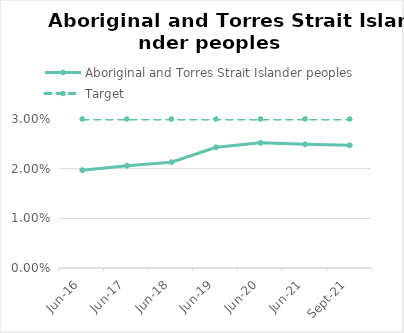
| Category | Aboriginal and Torres Strait Islander peoples | Target |
|---|---|---|
| 2016-06-01 | 0.02 | 0.03 |
| 2017-06-01 | 0.021 | 0.03 |
| 2018-06-01 | 0.021 | 0.03 |
| 2019-06-01 | 0.024 | 0.03 |
| 2020-06-01 | 0.025 | 0.03 |
| 2021-06-01 | 0.025 | 0.03 |
| 2021-09-01 | 0.025 | 0.03 |